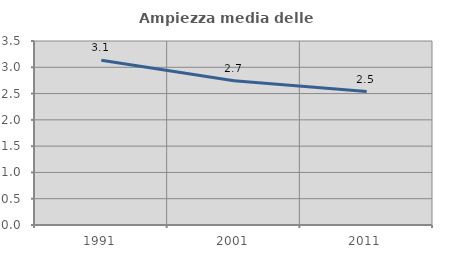
| Category | Ampiezza media delle famiglie |
|---|---|
| 1991.0 | 3.132 |
| 2001.0 | 2.744 |
| 2011.0 | 2.538 |